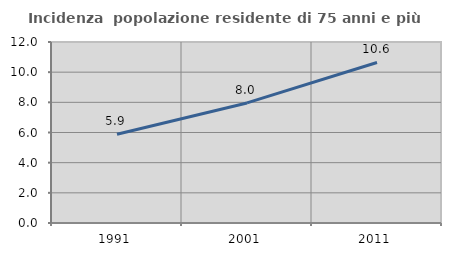
| Category | Incidenza  popolazione residente di 75 anni e più |
|---|---|
| 1991.0 | 5.886 |
| 2001.0 | 7.961 |
| 2011.0 | 10.644 |